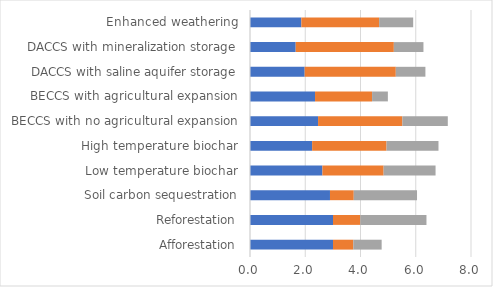
| Category | Feasibility | Climate Change Effectiveness | Side Impacts |
|---|---|---|---|
| Afforestation | 3.005 | 0.734 | 1.027 |
| Reforestation | 3.005 | 0.988 | 2.395 |
| Soil carbon sequestration | 2.895 | 0.861 | 2.29 |
| Low temperature biochar | 2.621 | 2.216 | 1.88 |
| High temperature biochar | 2.249 | 2.694 | 1.88 |
| BECCS with no agricultural expansion | 2.464 | 3.053 | 1.643 |
| BECCS with agricultural expansion | 2.354 | 2.065 | 0.572 |
| DACCS with saline aquifer storage | 1.979 | 3.299 | 1.072 |
| DACCS with mineralization storage | 1.654 | 3.553 | 1.072 |
| Enhanced weathering | 1.859 | 2.815 | 1.233 |